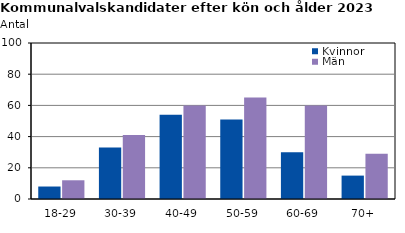
| Category | Kvinnor | Män |
|---|---|---|
| 18-29 | 8 | 12 |
| 30-39 | 33 | 41 |
| 40-49 | 54 | 60 |
| 50-59 | 51 | 65 |
| 60-69 | 30 | 60 |
| 70+ | 15 | 29 |